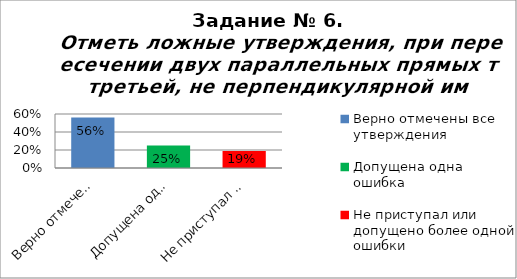
| Category | Отметь ложные утверждения, при пересечении двух параллельных прямых третьей, не перпендикулярной им. |
|---|---|
| Верно отмечены все утверждения | 0.56 |
| Допущена одна ошибка | 0.25 |
| Не приступал или допущено более одной ошибки | 0.19 |